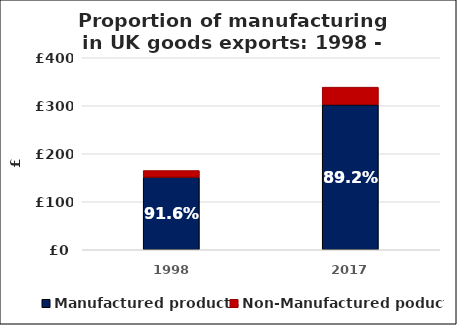
| Category | Manufactured products | Non-Manufactured poducts |
|---|---|---|
| 1998 | 151.2 | 13.9 |
| 2017 | 302.1 | 36.7 |